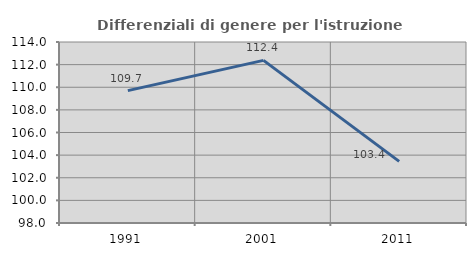
| Category | Differenziali di genere per l'istruzione superiore |
|---|---|
| 1991.0 | 109.701 |
| 2001.0 | 112.376 |
| 2011.0 | 103.448 |